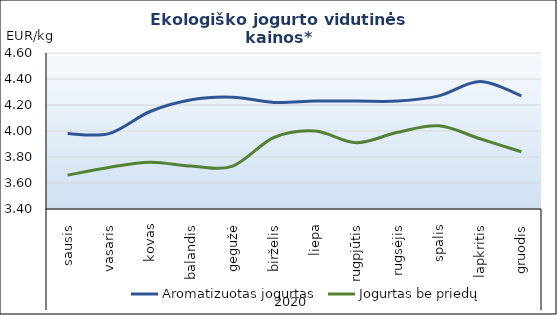
| Category | Aromatizuotas jogurtas | Jogurtas be priedų |
|---|---|---|
| 0 | 3.98 | 3.66 |
| 1 | 3.98 | 3.72 |
| 2 | 4.15 | 3.76 |
| 3 | 4.24 | 3.73 |
| 4 | 4.26 | 3.73 |
| 5 | 4.22 | 3.95 |
| 6 | 4.23 | 4 |
| 7 | 4.23 | 3.91 |
| 8 | 4.23 | 3.99 |
| 9 | 4.27 | 4.04 |
| 10 | 4.38 | 3.94 |
| 11 | 4.27 | 3.84 |